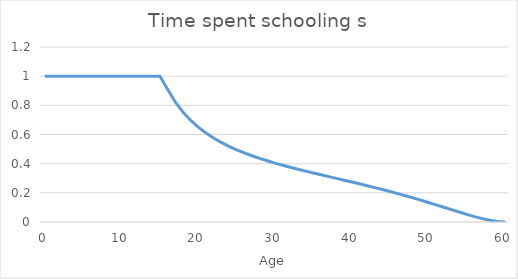
| Category | Time spent schooling s |
|---|---|
| 0.0 | 1 |
| 1.0 | 1 |
| 2.0 | 1 |
| 3.0 | 1 |
| 4.0 | 1 |
| 5.0 | 1 |
| 6.0 | 1 |
| 7.0 | 1 |
| 8.0 | 1 |
| 9.0 | 1 |
| 10.0 | 1 |
| 11.0 | 1 |
| 12.0 | 1 |
| 13.0 | 1 |
| 14.0 | 1 |
| 15.0 | 1 |
| 16.0 | 0.91 |
| 17.0 | 0.823 |
| 18.0 | 0.754 |
| 19.0 | 0.697 |
| 20.0 | 0.65 |
| 21.0 | 0.61 |
| 22.0 | 0.576 |
| 23.0 | 0.546 |
| 24.0 | 0.519 |
| 25.0 | 0.495 |
| 26.0 | 0.474 |
| 27.0 | 0.454 |
| 28.0 | 0.436 |
| 29.0 | 0.42 |
| 30.0 | 0.404 |
| 31.0 | 0.389 |
| 32.0 | 0.375 |
| 33.0 | 0.362 |
| 34.0 | 0.349 |
| 35.0 | 0.336 |
| 36.0 | 0.324 |
| 37.0 | 0.311 |
| 38.0 | 0.299 |
| 39.0 | 0.287 |
| 40.0 | 0.274 |
| 41.0 | 0.262 |
| 42.0 | 0.249 |
| 43.0 | 0.236 |
| 44.0 | 0.223 |
| 45.0 | 0.209 |
| 46.0 | 0.195 |
| 47.0 | 0.18 |
| 48.0 | 0.165 |
| 49.0 | 0.15 |
| 50.0 | 0.134 |
| 51.0 | 0.118 |
| 52.0 | 0.101 |
| 53.0 | 0.085 |
| 54.0 | 0.068 |
| 55.0 | 0.052 |
| 56.0 | 0.037 |
| 57.0 | 0.023 |
| 58.0 | 0.011 |
| 59.0 | 0.003 |
| 60.0 | 0 |